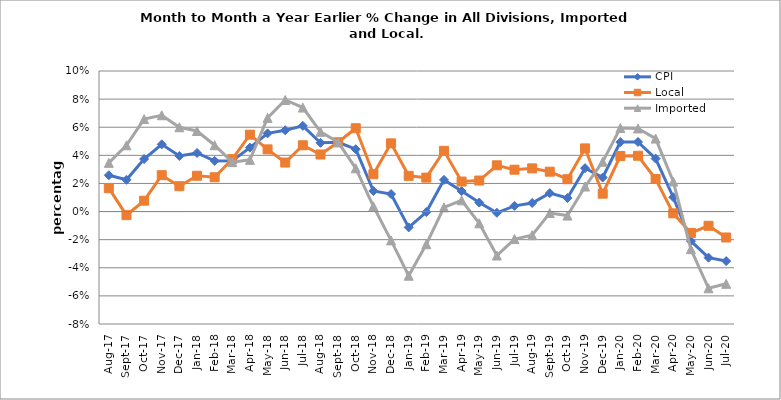
| Category | CPI | Local | Imported |
|---|---|---|---|
| 2017-08-01 | 0.026 | 0.017 | 0.035 |
| 2017-09-01 | 0.023 | -0.003 | 0.047 |
| 2017-10-01 | 0.037 | 0.008 | 0.066 |
| 2017-11-01 | 0.048 | 0.026 | 0.069 |
| 2017-12-01 | 0.04 | 0.018 | 0.06 |
| 2018-01-01 | 0.042 | 0.025 | 0.057 |
| 2018-02-01 | 0.036 | 0.024 | 0.047 |
| 2018-03-01 | 0.036 | 0.037 | 0.035 |
| 2018-04-01 | 0.045 | 0.055 | 0.037 |
| 2018-05-01 | 0.056 | 0.044 | 0.067 |
| 2018-06-01 | 0.058 | 0.035 | 0.079 |
| 2018-07-01 | 0.061 | 0.047 | 0.074 |
| 2018-08-01 | 0.049 | 0.041 | 0.057 |
| 2018-09-01 | 0.049 | 0.049 | 0.049 |
| 2018-10-01 | 0.044 | 0.059 | 0.031 |
| 2018-11-01 | 0.015 | 0.027 | 0.004 |
| 2018-12-01 | 0.012 | 0.049 | -0.021 |
| 2019-01-01 | -0.011 | 0.025 | -0.046 |
| 2019-02-01 | 0 | 0.024 | -0.023 |
| 2019-03-01 | 0.023 | 0.043 | 0.003 |
| 2019-04-01 | 0.015 | 0.021 | 0.008 |
| 2019-05-01 | 0.006 | 0.022 | -0.008 |
| 2019-06-01 | -0.001 | 0.033 | -0.031 |
| 2019-07-01 | 0.004 | 0.03 | -0.02 |
| 2019-08-01 | 0.006 | 0.031 | -0.017 |
| 2019-09-01 | 0.013 | 0.028 | -0.001 |
| 2019-10-01 | 0.01 | 0.023 | -0.003 |
| 2019-11-01 | 0.031 | 0.045 | 0.018 |
| 2019-12-01 | 0.024 | 0.013 | 0.035 |
| 2020-01-01 | 0.049 | 0.039 | 0.059 |
| 2020-02-01 | 0.05 | 0.04 | 0.059 |
| 2020-03-01 | 0.038 | 0.023 | 0.052 |
| 2020-04-01 | 0.01 | -0.001 | 0.021 |
| 2020-05-01 | -0.021 | -0.015 | -0.027 |
| 2020-06-01 | -0.033 | -0.01 | -0.055 |
| 2020-07-01 | -0.035 | -0.018 | -0.051 |